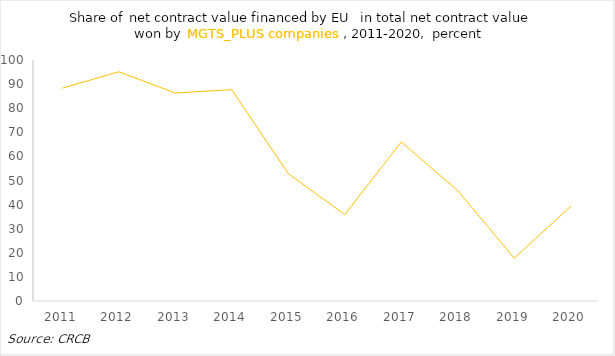
| Category | Series 0 |
|---|---|
| 2011.0 | 88.322 |
| 2012.0 | 95.113 |
| 2013.0 | 86.306 |
| 2014.0 | 87.711 |
| 2015.0 | 52.877 |
| 2016.0 | 35.853 |
| 2017.0 | 65.983 |
| 2018.0 | 45.804 |
| 2019.0 | 17.775 |
| 2020.0 | 39.29 |